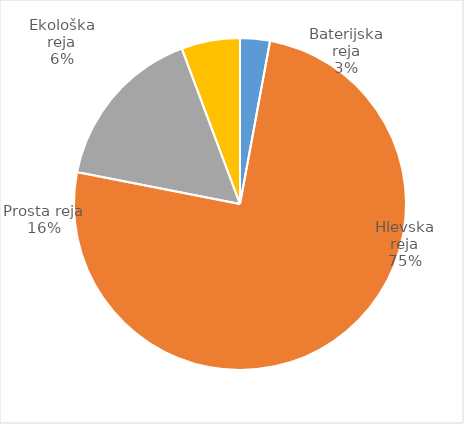
| Category | Število kosov jajc |
|---|---|
| Baterijska reja | 80760 |
| Hlevska reja | 2089796 |
| Prosta reja | 450945 |
| Ekološka reja | 158490 |